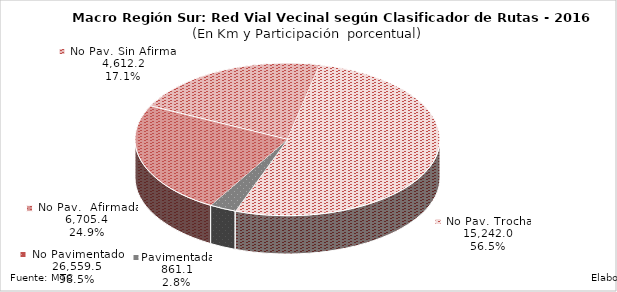
| Category | Series 0 |
|---|---|
| Pavimentada | 861.06 |
| No Pavimentada                   Afirmada | 7204.616 |
| No Pavimentada                   Sin Afirmar | 6399.68 |
| No Pavimentada                            Trocha | 15777.472 |